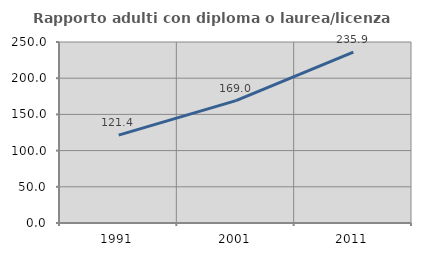
| Category | Rapporto adulti con diploma o laurea/licenza media  |
|---|---|
| 1991.0 | 121.361 |
| 2001.0 | 168.986 |
| 2011.0 | 235.93 |